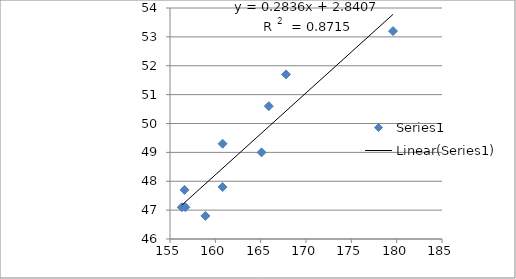
| Category | Series 0 |
|---|---|
| 156.3 | 47.1 |
| 158.9 | 46.8 |
| 160.8 | 49.3 |
| 179.6 | 53.2 |
| 156.6 | 47.7 |
| 165.1 | 49 |
| 165.9 | 50.6 |
| 156.7 | 47.1 |
| 167.8 | 51.7 |
| 160.8 | 47.8 |